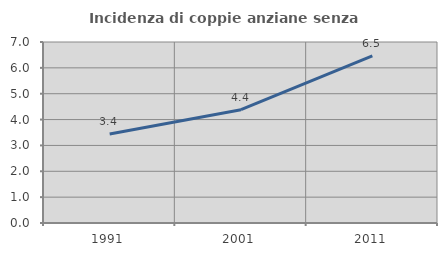
| Category | Incidenza di coppie anziane senza figli  |
|---|---|
| 1991.0 | 3.445 |
| 2001.0 | 4.381 |
| 2011.0 | 6.464 |